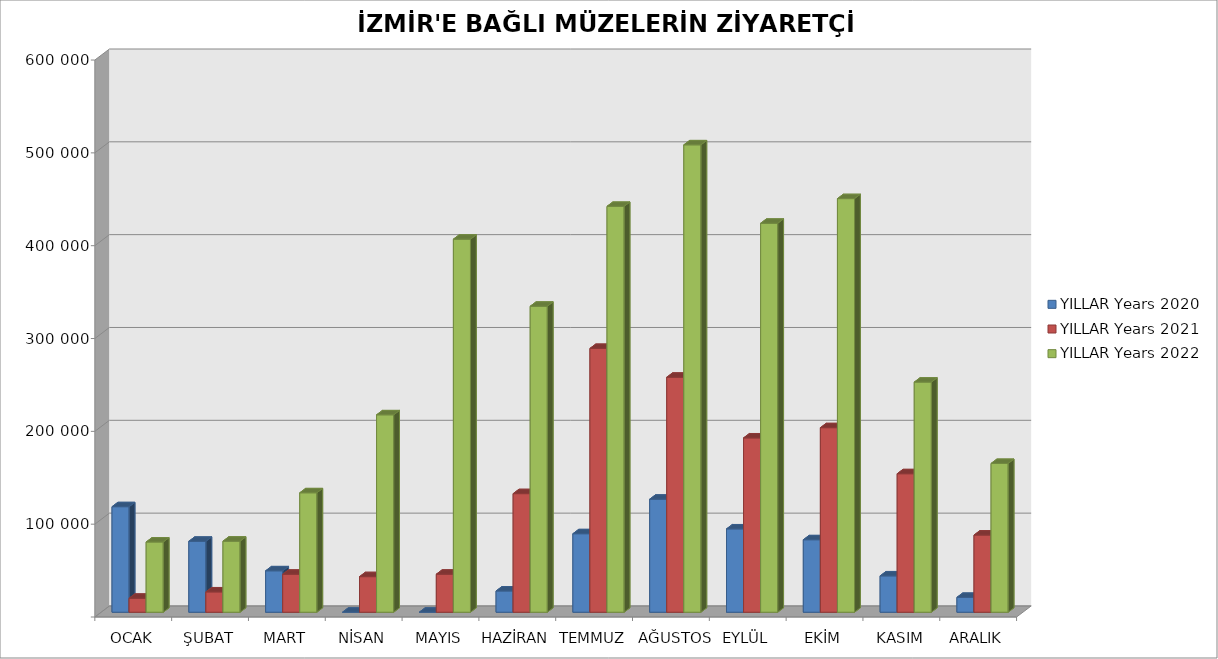
| Category | YILLAR Years 2020 | YILLAR Years 2021 | YILLAR Years 2022 |
|---|---|---|---|
| OCAK | 113675 | 14992 | 75648 |
| ŞUBAT | 76403 | 21877 | 76569 |
| MART | 44613 | 40903 | 128664 |
| NİSAN | 0 | 38306 | 212657 |
| MAYIS | 0 | 40946 | 401887 |
| HAZİRAN | 22885 | 127729 | 329617 |
| TEMMUZ | 84548 | 284174 | 437234 |
| AĞUSTOS | 121753 | 253129 | 503510 |
| EYLÜL | 89757 | 187775 | 419015 |
| EKİM | 78061 | 198786 | 445562 |
| KASIM | 39134 | 149190 | 247891 |
| ARALIK | 16010 | 83118 | 160286 |